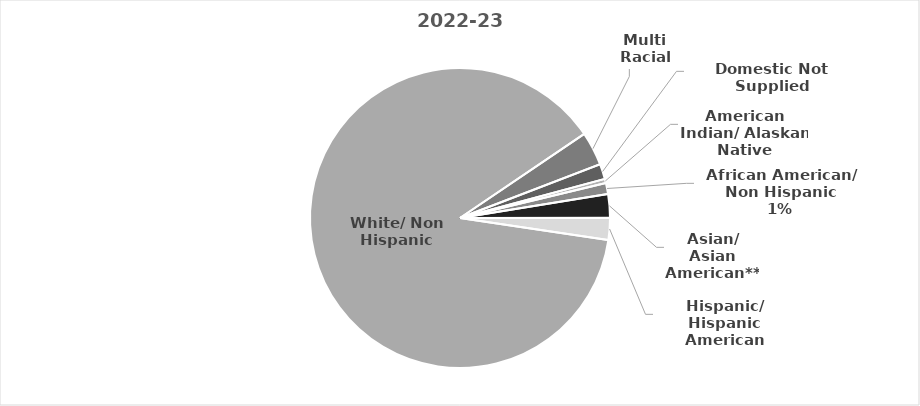
| Category | 2022-23 |
|---|---|
| Domestic Not Supplied | 18 |
| American Indian/ Alaskan Native | 5 |
| African American/ Non Hispanic | 13 |
| Asian/ Asian American** | 28 |
| Hispanic/ Hispanic American | 26 |
| White/ Non Hispanic | 970 |
| Multi Racial | 40 |